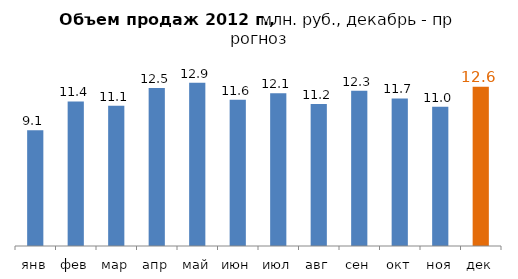
| Category | Объем продаж |
|---|---|
| янв | 9149321 |
| фев | 11431272 |
| мар | 11096305 |
| апр | 12491319 |
| май | 12921194 |
| июн | 11562298 |
| июл | 12080796 |
| авг | 11231029 |
| сен | 12277248 |
| окт | 11667224 |
| ноя | 11010476 |
| дек | 12600000 |